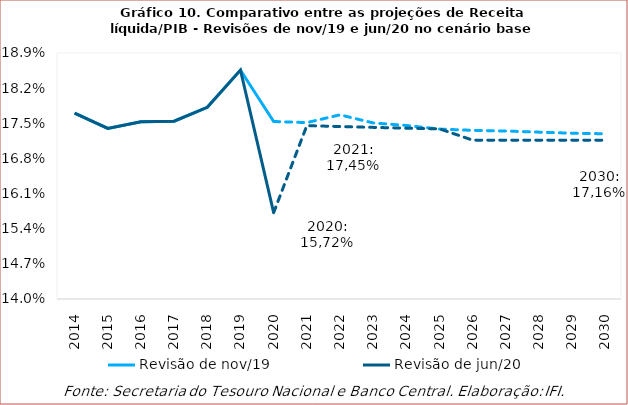
| Category | Revisão de nov/19 | Revisão de jun/20 |
|---|---|---|
| 2014.0 | 0.177 | 0.177 |
| 2015.0 | 0.174 | 0.174 |
| 2016.0 | 0.175 | 0.175 |
| 2017.0 | 0.175 | 0.175 |
| 2018.0 | 0.178 | 0.178 |
| 2019.0 | 0.186 | 0.186 |
| 2020.0 | 0.175 | 0.157 |
| 2021.0 | 0.175 | 0.175 |
| 2022.0 | 0.177 | 0.174 |
| 2023.0 | 0.175 | 0.174 |
| 2024.0 | 0.175 | 0.174 |
| 2025.0 | 0.174 | 0.174 |
| 2026.0 | 0.174 | 0.172 |
| 2027.0 | 0.173 | 0.172 |
| 2028.0 | 0.173 | 0.172 |
| 2029.0 | 0.173 | 0.172 |
| 2030.0 | 0.173 | 0.172 |